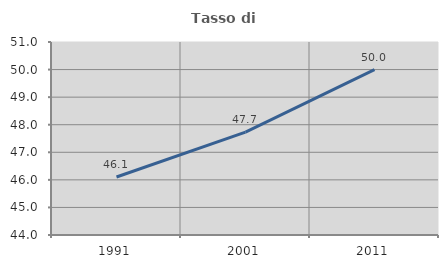
| Category | Tasso di occupazione   |
|---|---|
| 1991.0 | 46.104 |
| 2001.0 | 47.732 |
| 2011.0 | 50 |